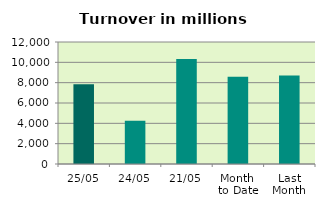
| Category | Series 0 |
|---|---|
| 25/05 | 7856.476 |
| 24/05 | 4264.266 |
| 21/05 | 10319.16 |
| Month 
to Date | 8573.917 |
| Last
Month | 8713.977 |